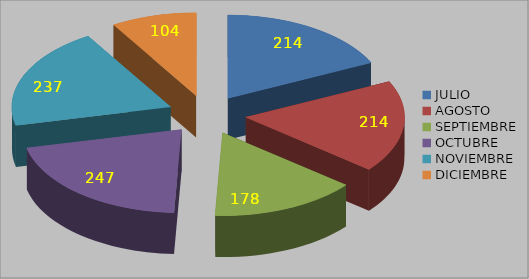
| Category | Series 0 |
|---|---|
| JULIO | 214 |
| AGOSTO | 214 |
| SEPTIEMBRE | 178 |
| OCTUBRE | 247 |
| NOVIEMBRE | 237 |
| DICIEMBRE | 104 |